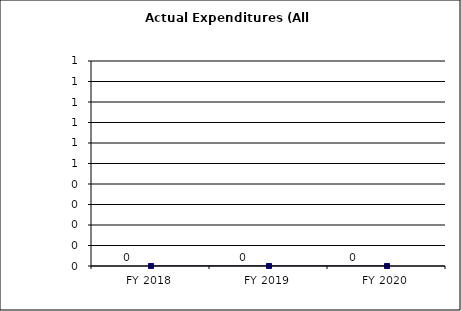
| Category | Actual Expenditures (All Funds) |
|---|---|
| FY 2018 | 0 |
| FY 2019 | 0 |
| FY 2020 | 0 |